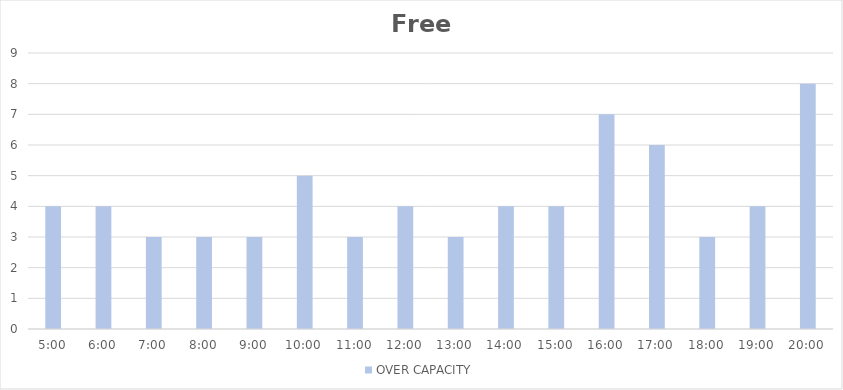
| Category | OVER CAPACITY |
|---|---|
| 0.20833333333333334 | 4 |
| 0.25 | 4 |
| 0.2916666666666667 | 3 |
| 0.3333333333333333 | 3 |
| 0.375 | 3 |
| 0.4166666666666667 | 5 |
| 0.4583333333333333 | 3 |
| 0.5 | 4 |
| 0.5416666666666666 | 3 |
| 0.5833333333333334 | 4 |
| 0.625 | 4 |
| 0.6666666666666666 | 7 |
| 0.7083333333333334 | 6 |
| 0.75 | 3 |
| 0.7916666666666666 | 4 |
| 0.8333333333333334 | 8 |